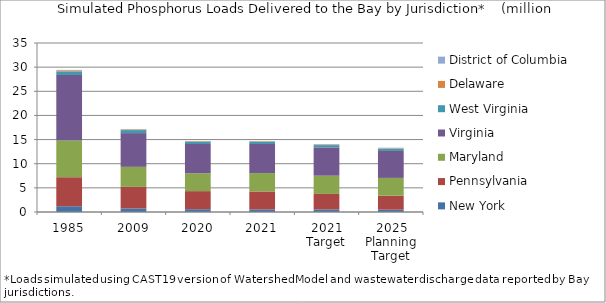
| Category | New York  | Pennsylvania  | Maryland  | Virginia  | West Virginia  | Delaware  | District of Columbia  |
|---|---|---|---|---|---|---|---|
| 1985 | 1.189 | 6.015 | 7.616 | 13.546 | 0.757 | 0.22 | 0.09 |
| 2009 | 0.739 | 4.461 | 4.153 | 6.985 | 0.631 | 0.132 | 0.072 |
| 2020 | 0.578 | 3.745 | 3.697 | 6.067 | 0.445 | 0.121 | 0.063 |
| 2021 | 0.539 | 3.715 | 3.803 | 6.028 | 0.438 | 0.12 | 0.07 |
| 2021 Target | 0.528 | 3.216 | 3.774 | 5.863 | 0.472 | 0.113 | 0.118 |
| 2025 Planning Target | 0.476 | 2.905 | 3.68 | 5.583 | 0.433 | 0.108 | 0.13 |